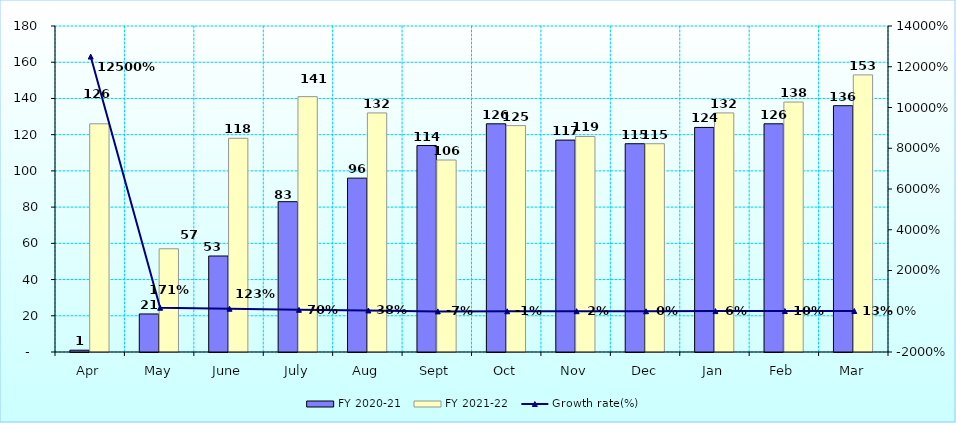
| Category | FY 2020-21 | FY 2021-22 |
|---|---|---|
| Apr | 1 | 126 |
| May | 21 | 57 |
| June | 53 | 118 |
| July | 83 | 141 |
| Aug | 96 | 132 |
| Sept | 114 | 106 |
| Oct | 126 | 125 |
| Nov | 117 | 119 |
| Dec | 115 | 115 |
| Jan | 124 | 132 |
| Feb | 126 | 138 |
| Mar | 136 | 153 |